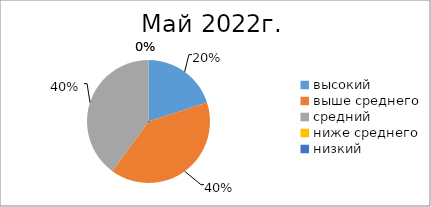
| Category | Series 0 |
|---|---|
| высокий | 3 |
| выше среднего | 6 |
| средний | 6 |
| ниже среднего | 0 |
| низкий | 0 |